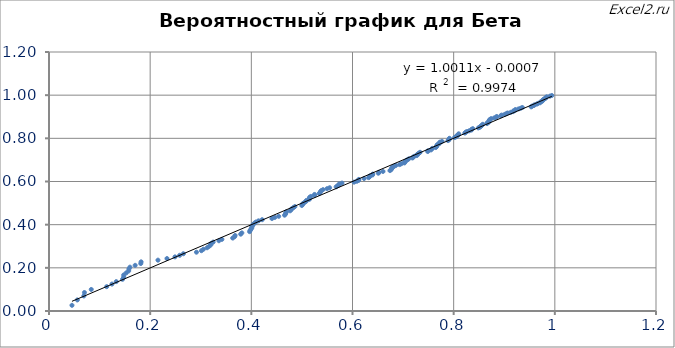
| Category | Массив сорт |
|---|---|
| 0.045433433892403716 | 0.026 |
| 0.056027873965567986 | 0.051 |
| 0.06888495389834502 | 0.07 |
| 0.0700611584212387 | 0.086 |
| 0.08353478935333376 | 0.1 |
| 0.11406165151096935 | 0.113 |
| 0.12450900812946876 | 0.125 |
| 0.1329369102499814 | 0.136 |
| 0.14528961445058552 | 0.147 |
| 0.14759649051972537 | 0.157 |
| 0.147715033925954 | 0.167 |
| 0.15261622268919656 | 0.176 |
| 0.15755444153111944 | 0.186 |
| 0.15790929055555283 | 0.195 |
| 0.15998327963357084 | 0.203 |
| 0.17032390246203996 | 0.212 |
| 0.18145538016763987 | 0.22 |
| 0.18208008984713475 | 0.228 |
| 0.21541905281929785 | 0.236 |
| 0.23324645691588475 | 0.243 |
| 0.24908028499720083 | 0.251 |
| 0.258383423196353 | 0.258 |
| 0.26562645682544495 | 0.265 |
| 0.2914996674944255 | 0.272 |
| 0.30132656544412373 | 0.279 |
| 0.30525018286260114 | 0.286 |
| 0.3126531164153694 | 0.293 |
| 0.3165363356231961 | 0.3 |
| 0.3198969889617138 | 0.306 |
| 0.3202175242128773 | 0.313 |
| 0.32452540089657944 | 0.319 |
| 0.33594281213268307 | 0.325 |
| 0.3417990006004295 | 0.332 |
| 0.36318006384993157 | 0.338 |
| 0.3668991172781973 | 0.344 |
| 0.36796829172556417 | 0.35 |
| 0.37896262226782235 | 0.356 |
| 0.38122597218568643 | 0.362 |
| 0.3965680428947372 | 0.368 |
| 0.39768350563936056 | 0.373 |
| 0.399276827591535 | 0.379 |
| 0.4008560549197816 | 0.385 |
| 0.4009359697811978 | 0.39 |
| 0.40245070739665867 | 0.396 |
| 0.4036362899819016 | 0.401 |
| 0.4061187375807937 | 0.407 |
| 0.4090648667888838 | 0.412 |
| 0.4142219363228655 | 0.418 |
| 0.42142756265894243 | 0.423 |
| 0.44078677036088565 | 0.428 |
| 0.4464438352588974 | 0.434 |
| 0.45409096618481515 | 0.439 |
| 0.46567787747020944 | 0.444 |
| 0.4676561562654291 | 0.449 |
| 0.46797433278542067 | 0.454 |
| 0.46928770886631277 | 0.459 |
| 0.4766669250207732 | 0.464 |
| 0.4786668640503521 | 0.469 |
| 0.4799847033217593 | 0.474 |
| 0.48329356232216275 | 0.479 |
| 0.4860566513719729 | 0.484 |
| 0.499813184223397 | 0.489 |
| 0.5015582976792647 | 0.493 |
| 0.5020841007670916 | 0.498 |
| 0.5052107538195063 | 0.503 |
| 0.5080456360054457 | 0.508 |
| 0.5089719530366942 | 0.512 |
| 0.5145997051913703 | 0.517 |
| 0.5146874115440656 | 0.522 |
| 0.5151591523508756 | 0.526 |
| 0.5175936771368168 | 0.531 |
| 0.5247938032538965 | 0.535 |
| 0.5249738218512753 | 0.54 |
| 0.5340885852000319 | 0.545 |
| 0.5360601188020493 | 0.549 |
| 0.5368605363831742 | 0.553 |
| 0.5382849132923382 | 0.558 |
| 0.5417554549863935 | 0.562 |
| 0.5496656045989439 | 0.567 |
| 0.5547569035639276 | 0.571 |
| 0.5676545196156519 | 0.575 |
| 0.5703253992589091 | 0.58 |
| 0.5736134308067475 | 0.584 |
| 0.5736203974777465 | 0.588 |
| 0.5791977402297507 | 0.593 |
| 0.6031482055198804 | 0.597 |
| 0.6086030459549575 | 0.601 |
| 0.6122228285725351 | 0.605 |
| 0.612454973495684 | 0.61 |
| 0.6229394119749515 | 0.614 |
| 0.6318362100260267 | 0.618 |
| 0.6338840870744715 | 0.622 |
| 0.6345303804719656 | 0.626 |
| 0.6395300763890467 | 0.63 |
| 0.6400319862184557 | 0.634 |
| 0.6510710082066166 | 0.638 |
| 0.6525741196757634 | 0.642 |
| 0.6603105251401565 | 0.646 |
| 0.6740506930000779 | 0.651 |
| 0.6761587801947664 | 0.655 |
| 0.677133593760002 | 0.658 |
| 0.6775533956214543 | 0.662 |
| 0.679745565391833 | 0.666 |
| 0.6823049400528691 | 0.67 |
| 0.6856984767750546 | 0.674 |
| 0.6930821317134602 | 0.678 |
| 0.6964168060853073 | 0.682 |
| 0.7026942231516898 | 0.686 |
| 0.70283099014151 | 0.69 |
| 0.7048619114946013 | 0.694 |
| 0.7064638568391305 | 0.698 |
| 0.7090914083328219 | 0.701 |
| 0.7113773042548727 | 0.705 |
| 0.718510397646186 | 0.709 |
| 0.7201073581847299 | 0.713 |
| 0.721946386382002 | 0.717 |
| 0.727346206177386 | 0.72 |
| 0.7273772114986788 | 0.724 |
| 0.7296511246501698 | 0.728 |
| 0.7313683786133569 | 0.732 |
| 0.7336234817617715 | 0.735 |
| 0.7487322249337145 | 0.739 |
| 0.7492176077634951 | 0.743 |
| 0.7550775752090583 | 0.746 |
| 0.7561371880598651 | 0.75 |
| 0.7578454436424694 | 0.754 |
| 0.7643687799499858 | 0.757 |
| 0.765805838112029 | 0.761 |
| 0.766583202049809 | 0.764 |
| 0.767010081711423 | 0.768 |
| 0.7683144955058236 | 0.772 |
| 0.7715334056055744 | 0.775 |
| 0.7716481396205795 | 0.779 |
| 0.773069234328077 | 0.782 |
| 0.7770306591753567 | 0.786 |
| 0.788773788556177 | 0.79 |
| 0.7906402731994029 | 0.793 |
| 0.7910918171975143 | 0.797 |
| 0.7915793060457142 | 0.8 |
| 0.8017606510208951 | 0.804 |
| 0.8049644363430432 | 0.807 |
| 0.8053571632639656 | 0.811 |
| 0.8084997272615831 | 0.814 |
| 0.8094233275304604 | 0.818 |
| 0.809909786717676 | 0.821 |
| 0.8220421728406409 | 0.824 |
| 0.8238630760771768 | 0.828 |
| 0.8257797387603147 | 0.831 |
| 0.8303662934269997 | 0.835 |
| 0.834987848340677 | 0.838 |
| 0.8355512403902916 | 0.841 |
| 0.8377677970536069 | 0.845 |
| 0.848817937466295 | 0.848 |
| 0.8520422679547801 | 0.852 |
| 0.8527001742200058 | 0.855 |
| 0.8550914511189808 | 0.858 |
| 0.8563343409786248 | 0.862 |
| 0.8576816569526304 | 0.865 |
| 0.8661477765542566 | 0.868 |
| 0.8662159983125768 | 0.872 |
| 0.8694176960689372 | 0.875 |
| 0.8698488144593087 | 0.878 |
| 0.8700320728459185 | 0.882 |
| 0.8706487138146437 | 0.885 |
| 0.8722605049857154 | 0.888 |
| 0.8743985292920117 | 0.891 |
| 0.8804605326593424 | 0.895 |
| 0.8845065489188627 | 0.898 |
| 0.8851163027741789 | 0.901 |
| 0.8930494528596236 | 0.904 |
| 0.8947594917004484 | 0.908 |
| 0.9008869272643876 | 0.911 |
| 0.9042438574324916 | 0.914 |
| 0.906538195800147 | 0.917 |
| 0.9129343967416146 | 0.921 |
| 0.9174997034481402 | 0.924 |
| 0.9181893237988586 | 0.927 |
| 0.921887890980417 | 0.93 |
| 0.9221436066363949 | 0.933 |
| 0.9283668472536045 | 0.936 |
| 0.9327077878201162 | 0.94 |
| 0.9357342637565539 | 0.943 |
| 0.9532320548007855 | 0.946 |
| 0.9549828883519258 | 0.949 |
| 0.9587011954415829 | 0.952 |
| 0.9598935258267871 | 0.955 |
| 0.9641968524012112 | 0.958 |
| 0.9665142865785203 | 0.962 |
| 0.9708405766256081 | 0.965 |
| 0.9711452195212414 | 0.968 |
| 0.9740605939451821 | 0.971 |
| 0.975930732716205 | 0.974 |
| 0.9760874194538773 | 0.977 |
| 0.9774941468393354 | 0.98 |
| 0.9797318743472794 | 0.983 |
| 0.9820836920468754 | 0.986 |
| 0.9823042244467923 | 0.989 |
| 0.9839337243417896 | 0.992 |
| 0.9903572246110184 | 0.995 |
| 0.9940035083698773 | 0.998 |